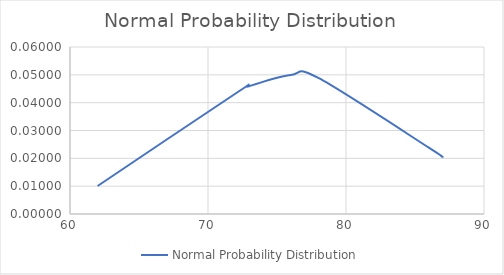
| Category | Normal Probability Distribution |
|---|---|
| 62.0 | 0.01 |
| 72.0 | 0.043 |
| 73.0 | 0.046 |
| 76.0 | 0.05 |
| 78.0 | 0.049 |
| 86.0 | 0.024 |
| 87.0 | 0.02 |